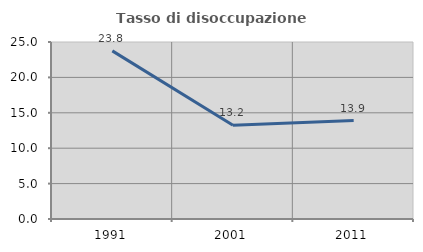
| Category | Tasso di disoccupazione giovanile  |
|---|---|
| 1991.0 | 23.75 |
| 2001.0 | 13.235 |
| 2011.0 | 13.907 |